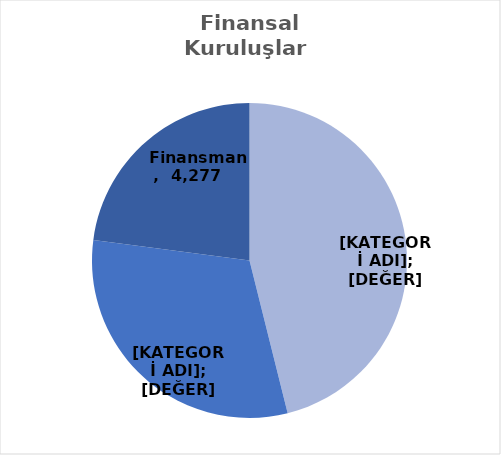
| Category | Series 0 |
|---|---|
| Finansal Kiralama  | 8604 |
| Faktoring  | 5781 |
| Finansman | 4277 |